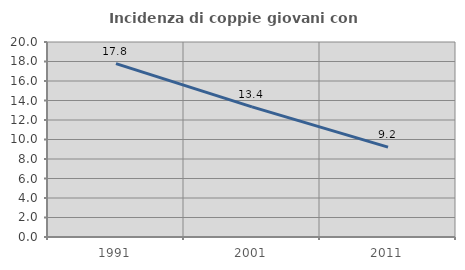
| Category | Incidenza di coppie giovani con figli |
|---|---|
| 1991.0 | 17.778 |
| 2001.0 | 13.352 |
| 2011.0 | 9.222 |